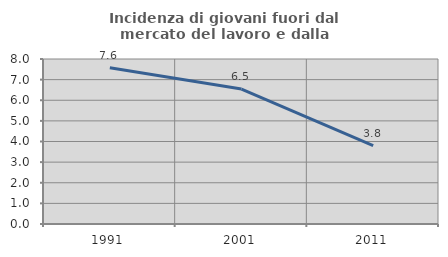
| Category | Incidenza di giovani fuori dal mercato del lavoro e dalla formazione  |
|---|---|
| 1991.0 | 7.576 |
| 2001.0 | 6.542 |
| 2011.0 | 3.797 |